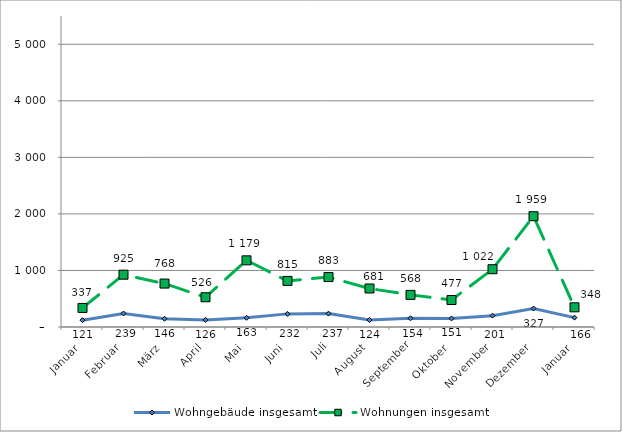
| Category | Wohngebäude insgesamt | Wohnungen insgesamt |
|---|---|---|
| Januar | 121 | 337 |
| Februar | 239 | 925 |
| März | 146 | 768 |
| April | 126 | 526 |
| Mai | 163 | 1179 |
| Juni | 232 | 815 |
| Juli | 237 | 883 |
| August | 124 | 681 |
| September | 154 | 568 |
| Oktober | 151 | 477 |
| November | 201 | 1022 |
| Dezember | 327 | 1959 |
| Januar | 166 | 348 |